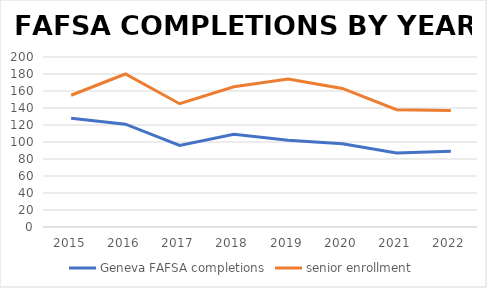
| Category | Geneva FAFSA completions | senior enrollment |
|---|---|---|
| 2015.0 | 128 | 155 |
| 2016.0 | 121 | 180 |
| 2017.0 | 96 | 145 |
| 2018.0 | 109 | 165 |
| 2019.0 | 102 | 174 |
| 2020.0 | 98 | 163 |
| 2021.0 | 87 | 138 |
| 2022.0 | 89 | 137 |